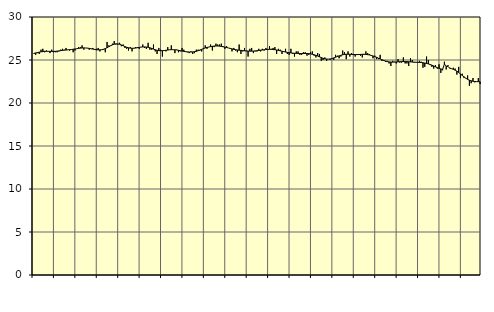
| Category | Piggar | Series 1 |
|---|---|---|
| nan | 25.7 | 25.77 |
| 1.0 | 25.6 | 25.82 |
| 1.0 | 25.8 | 25.87 |
| 1.0 | 25.7 | 25.91 |
| 1.0 | 26.2 | 25.95 |
| 1.0 | 26.3 | 25.98 |
| 1.0 | 25.9 | 26.01 |
| 1.0 | 26.1 | 26.01 |
| 1.0 | 26 | 26.01 |
| 1.0 | 25.8 | 26 |
| 1.0 | 26.2 | 26 |
| 1.0 | 25.9 | 26 |
| nan | 25.9 | 26.01 |
| 2.0 | 25.9 | 26.03 |
| 2.0 | 26 | 26.06 |
| 2.0 | 26.2 | 26.09 |
| 2.0 | 26.3 | 26.12 |
| 2.0 | 26.2 | 26.14 |
| 2.0 | 26.4 | 26.16 |
| 2.0 | 26.2 | 26.18 |
| 2.0 | 26.1 | 26.2 |
| 2.0 | 26.2 | 26.22 |
| 2.0 | 25.9 | 26.25 |
| 2.0 | 26.1 | 26.28 |
| nan | 26.3 | 26.31 |
| 3.0 | 26.5 | 26.35 |
| 3.0 | 26.5 | 26.38 |
| 3.0 | 26.7 | 26.4 |
| 3.0 | 26.2 | 26.41 |
| 3.0 | 26.4 | 26.4 |
| 3.0 | 26.4 | 26.38 |
| 3.0 | 26.2 | 26.35 |
| 3.0 | 26.3 | 26.31 |
| 3.0 | 26.4 | 26.27 |
| 3.0 | 26.2 | 26.23 |
| 3.0 | 26.3 | 26.19 |
| nan | 26.4 | 26.18 |
| 4.0 | 26 | 26.18 |
| 4.0 | 26.2 | 26.2 |
| 4.0 | 26.2 | 26.25 |
| 4.0 | 25.9 | 26.33 |
| 4.0 | 27.1 | 26.43 |
| 4.0 | 26.7 | 26.55 |
| 4.0 | 26.7 | 26.66 |
| 4.0 | 26.9 | 26.76 |
| 4.0 | 27.2 | 26.84 |
| 4.0 | 26.8 | 26.88 |
| 4.0 | 26.8 | 26.87 |
| nan | 27 | 26.83 |
| 5.0 | 26.6 | 26.75 |
| 5.0 | 26.8 | 26.66 |
| 5.0 | 26.4 | 26.56 |
| 5.0 | 26.3 | 26.48 |
| 5.0 | 26.1 | 26.42 |
| 5.0 | 26.5 | 26.38 |
| 5.0 | 26 | 26.36 |
| 5.0 | 26.4 | 26.37 |
| 5.0 | 26.5 | 26.39 |
| 5.0 | 26.5 | 26.43 |
| 5.0 | 26.3 | 26.46 |
| nan | 26.5 | 26.5 |
| 6.0 | 26.8 | 26.52 |
| 6.0 | 26.4 | 26.52 |
| 6.0 | 26.3 | 26.51 |
| 6.0 | 27 | 26.48 |
| 6.0 | 26.2 | 26.42 |
| 6.0 | 26.2 | 26.35 |
| 6.0 | 26.8 | 26.27 |
| 6.0 | 26 | 26.19 |
| 6.0 | 25.7 | 26.13 |
| 6.0 | 26.4 | 26.09 |
| 6.0 | 26.2 | 26.08 |
| nan | 25.4 | 26.08 |
| 7.0 | 26.1 | 26.1 |
| 7.0 | 26 | 26.13 |
| 7.0 | 26.5 | 26.16 |
| 7.0 | 26.2 | 26.19 |
| 7.0 | 26.7 | 26.2 |
| 7.0 | 26.2 | 26.2 |
| 7.0 | 25.8 | 26.19 |
| 7.0 | 26.2 | 26.17 |
| 7.0 | 25.9 | 26.13 |
| 7.0 | 26 | 26.08 |
| 7.0 | 26.4 | 26.04 |
| nan | 26.2 | 26 |
| 8.0 | 26 | 25.97 |
| 8.0 | 25.9 | 25.95 |
| 8.0 | 25.8 | 25.93 |
| 8.0 | 26 | 25.93 |
| 8.0 | 25.7 | 25.94 |
| 8.0 | 25.8 | 25.97 |
| 8.0 | 26.2 | 26.01 |
| 8.0 | 26.2 | 26.08 |
| 8.0 | 26.1 | 26.16 |
| 8.0 | 26 | 26.24 |
| 8.0 | 26.4 | 26.32 |
| nan | 26.7 | 26.4 |
| 9.0 | 26.3 | 26.46 |
| 9.0 | 26.5 | 26.51 |
| 9.0 | 26.8 | 26.56 |
| 9.0 | 26.1 | 26.59 |
| 9.0 | 26.5 | 26.62 |
| 9.0 | 26.9 | 26.63 |
| 9.0 | 26.8 | 26.63 |
| 9.0 | 26.8 | 26.61 |
| 9.0 | 26.9 | 26.58 |
| 9.0 | 26.5 | 26.55 |
| 9.0 | 26.3 | 26.5 |
| nan | 26.6 | 26.45 |
| 10.0 | 26.4 | 26.4 |
| 10.0 | 26.3 | 26.35 |
| 10.0 | 26 | 26.29 |
| 10.0 | 26.4 | 26.24 |
| 10.0 | 26.1 | 26.2 |
| 10.0 | 25.9 | 26.17 |
| 10.0 | 26.8 | 26.14 |
| 10.0 | 25.7 | 26.12 |
| 10.0 | 26 | 26.09 |
| 10.0 | 26.4 | 26.07 |
| 10.0 | 26.1 | 26.05 |
| nan | 25.4 | 26.04 |
| 11.0 | 26.3 | 26.03 |
| 11.0 | 26.4 | 26.03 |
| 11.0 | 25.8 | 26.04 |
| 11.0 | 26 | 26.06 |
| 11.0 | 26 | 26.08 |
| 11.0 | 26.3 | 26.11 |
| 11.0 | 26 | 26.14 |
| 11.0 | 26.3 | 26.16 |
| 11.0 | 26.1 | 26.19 |
| 11.0 | 26.4 | 26.22 |
| 11.0 | 26.2 | 26.23 |
| nan | 26.6 | 26.24 |
| 12.0 | 26.3 | 26.24 |
| 12.0 | 26.4 | 26.22 |
| 12.0 | 26.5 | 26.2 |
| 12.0 | 25.7 | 26.16 |
| 12.0 | 26.3 | 26.12 |
| 12.0 | 26.2 | 26.07 |
| 12.0 | 25.7 | 26.02 |
| 12.0 | 26 | 25.97 |
| 12.0 | 26.3 | 25.93 |
| 12.0 | 25.7 | 25.89 |
| 12.0 | 25.6 | 25.85 |
| nan | 26.3 | 25.83 |
| 13.0 | 25.7 | 25.8 |
| 13.0 | 25.4 | 25.78 |
| 13.0 | 26 | 25.77 |
| 13.0 | 26 | 25.76 |
| 13.0 | 25.6 | 25.75 |
| 13.0 | 25.6 | 25.75 |
| 13.0 | 25.9 | 25.75 |
| 13.0 | 25.9 | 25.76 |
| 13.0 | 25.5 | 25.75 |
| 13.0 | 25.6 | 25.74 |
| 13.0 | 25.9 | 25.71 |
| nan | 26 | 25.67 |
| 14.0 | 25.5 | 25.61 |
| 14.0 | 25.3 | 25.54 |
| 14.0 | 25.8 | 25.46 |
| 14.0 | 25.7 | 25.37 |
| 14.0 | 24.9 | 25.28 |
| 14.0 | 25 | 25.2 |
| 14.0 | 25.3 | 25.14 |
| 14.0 | 24.9 | 25.11 |
| 14.0 | 25.1 | 25.1 |
| 14.0 | 25 | 25.12 |
| 14.0 | 25.2 | 25.17 |
| nan | 25 | 25.24 |
| 15.0 | 25.6 | 25.32 |
| 15.0 | 25.5 | 25.4 |
| 15.0 | 25.2 | 25.48 |
| 15.0 | 25.4 | 25.55 |
| 15.0 | 26.1 | 25.61 |
| 15.0 | 25.9 | 25.65 |
| 15.0 | 25.1 | 25.67 |
| 15.0 | 26 | 25.67 |
| 15.0 | 25.4 | 25.67 |
| 15.0 | 25.8 | 25.65 |
| 15.0 | 25.7 | 25.63 |
| nan | 25.4 | 25.63 |
| 16.0 | 25.7 | 25.63 |
| 16.0 | 25.7 | 25.63 |
| 16.0 | 25.5 | 25.65 |
| 16.0 | 25.3 | 25.66 |
| 16.0 | 25.7 | 25.66 |
| 16.0 | 26 | 25.65 |
| 16.0 | 25.8 | 25.62 |
| 16.0 | 25.7 | 25.59 |
| 16.0 | 25.5 | 25.53 |
| 16.0 | 25.2 | 25.47 |
| 16.0 | 25.5 | 25.39 |
| nan | 25.1 | 25.31 |
| 17.0 | 25.1 | 25.21 |
| 17.0 | 25.6 | 25.12 |
| 17.0 | 24.9 | 25.03 |
| 17.0 | 25 | 24.95 |
| 17.0 | 24.8 | 24.88 |
| 17.0 | 24.9 | 24.82 |
| 17.0 | 24.6 | 24.78 |
| 17.0 | 24.3 | 24.76 |
| 17.0 | 24.9 | 24.75 |
| 17.0 | 24.8 | 24.76 |
| 17.0 | 24.6 | 24.77 |
| nan | 25.1 | 24.79 |
| 18.0 | 24.7 | 24.8 |
| 18.0 | 24.7 | 24.81 |
| 18.0 | 25.3 | 24.82 |
| 18.0 | 24.6 | 24.82 |
| 18.0 | 24.6 | 24.81 |
| 18.0 | 24.3 | 24.8 |
| 18.0 | 25.2 | 24.78 |
| 18.0 | 25 | 24.76 |
| 18.0 | 24.7 | 24.75 |
| 18.0 | 24.7 | 24.74 |
| 18.0 | 24.7 | 24.73 |
| nan | 24.9 | 24.72 |
| 19.0 | 24.8 | 24.71 |
| 19.0 | 24.1 | 24.68 |
| 19.0 | 24.2 | 24.65 |
| 19.0 | 25.4 | 24.6 |
| 19.0 | 25 | 24.55 |
| 19.0 | 24.4 | 24.48 |
| 19.0 | 24.2 | 24.4 |
| 19.0 | 24 | 24.31 |
| 19.0 | 24.4 | 24.21 |
| 19.0 | 24 | 24.11 |
| 19.0 | 24.5 | 24.03 |
| nan | 23.5 | 23.96 |
| 20.0 | 23.8 | 23.91 |
| 20.0 | 24.8 | 24.53 |
| 20.0 | 23.9 | 24.28 |
| 20.0 | 24.4 | 24.25 |
| 20.0 | 24.1 | 24.04 |
| 20.0 | 24 | 23.99 |
| 20.0 | 24.1 | 23.92 |
| 20.0 | 24 | 23.82 |
| 20.0 | 23.3 | 23.7 |
| 20.0 | 24.2 | 23.55 |
| 20.0 | 22.9 | 23.38 |
| nan | 23.4 | 23.2 |
| 21.0 | 22.9 | 23.04 |
| 21.0 | 22.9 | 22.88 |
| 21.0 | 23.2 | 22.75 |
| 21.0 | 22 | 22.65 |
| 21.0 | 22.3 | 22.58 |
| 21.0 | 22.9 | 22.53 |
| 21.0 | 22.4 | 22.5 |
| 21.0 | 22.5 | 22.49 |
| 21.0 | 22.9 | 22.48 |
| 21.0 | 22.2 | 22.47 |